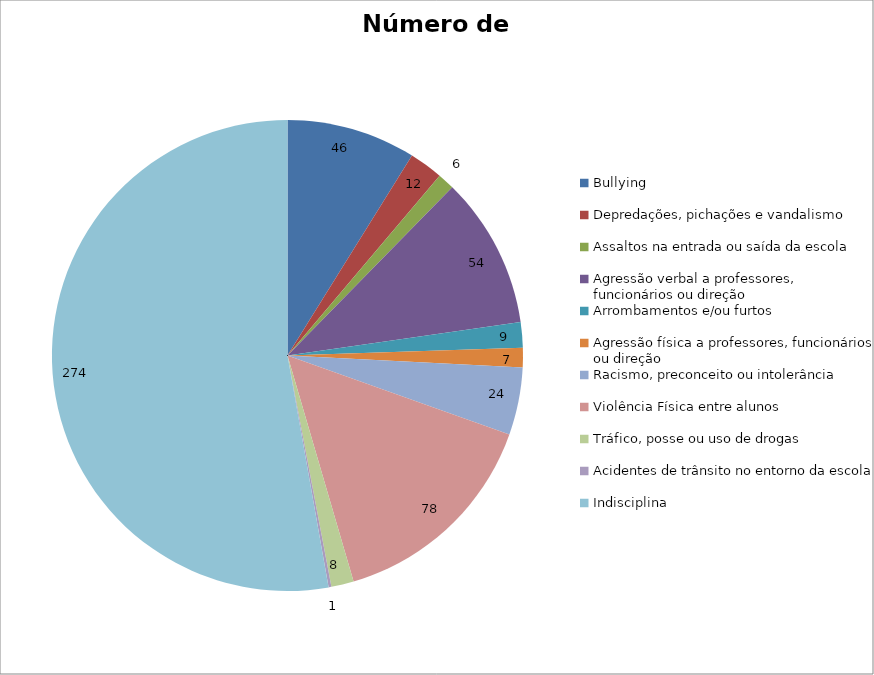
| Category | Número de Casos |
|---|---|
| Bullying | 46 |
| Depredações, pichações e vandalismo | 12 |
| Assaltos na entrada ou saída da escola | 6 |
| Agressão verbal a professores, funcionários ou direção | 54 |
| Arrombamentos e/ou furtos | 9 |
| Agressão física a professores, funcionários ou direção | 7 |
| Racismo, preconceito ou intolerância | 24 |
| Violência Física entre alunos | 78 |
| Tráfico, posse ou uso de drogas | 8 |
| Acidentes de trânsito no entorno da escola | 1 |
| Indisciplina | 274 |